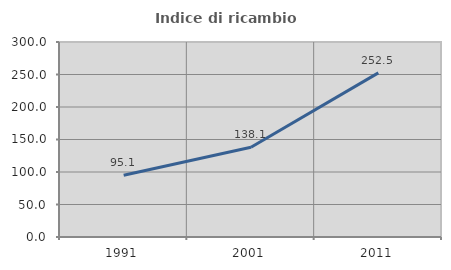
| Category | Indice di ricambio occupazionale  |
|---|---|
| 1991.0 | 95.129 |
| 2001.0 | 138.117 |
| 2011.0 | 252.532 |